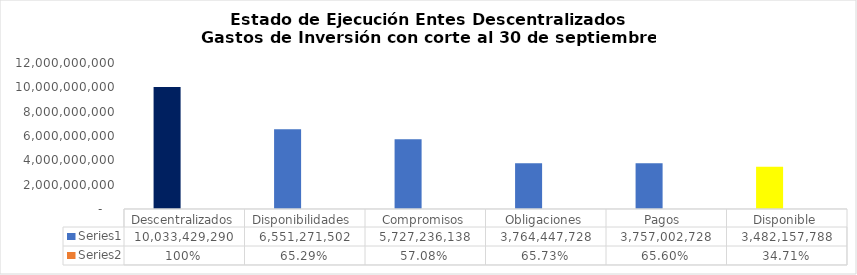
| Category | Series 0 | Series 1 |
|---|---|---|
| Descentralizados | 10033429290.13 | 1 |
| Disponibilidades  | 6551271501.96 | 0.653 |
| Compromisos | 5727236137.92 | 0.571 |
| Obligaciones | 3764447727.53 | 0.657 |
| Pagos  | 3757002727.53 | 0.656 |
| Disponible | 3482157788.17 | 0.347 |